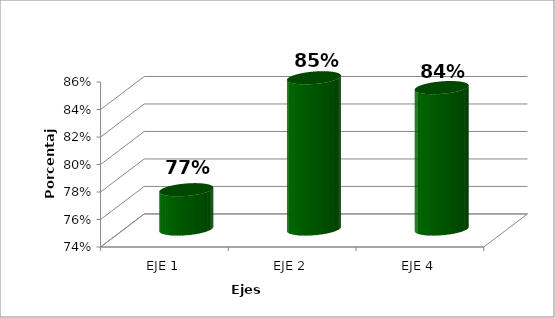
| Category | Series 0 |
|---|---|
| EJE 1 | 0.769 |
| EJE 2 | 0.85 |
| EJE 4 | 0.843 |